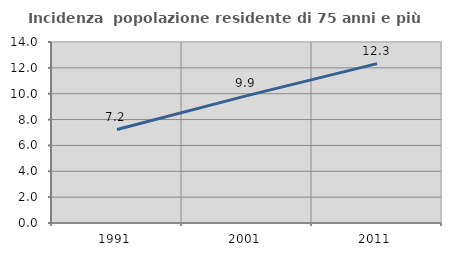
| Category | Incidenza  popolazione residente di 75 anni e più |
|---|---|
| 1991.0 | 7.231 |
| 2001.0 | 9.853 |
| 2011.0 | 12.329 |